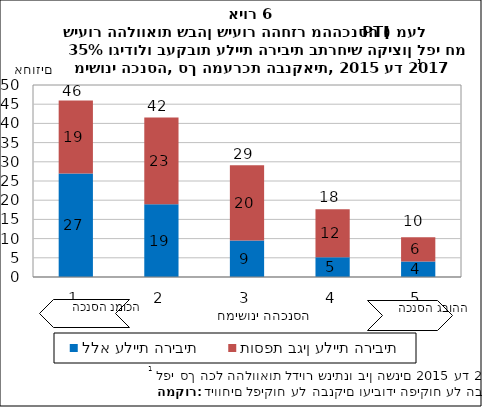
| Category | ללא עליית הריבית | תוספת בגין עליית הריבית |
|---|---|---|
| 1.0 | 26.937 | 19.039 |
| 2.0 | 18.937 | 22.619 |
| 3.0 | 9.474 | 19.616 |
| 4.0 | 5.175 | 12.454 |
| 5.0 | 4.005 | 6.342 |